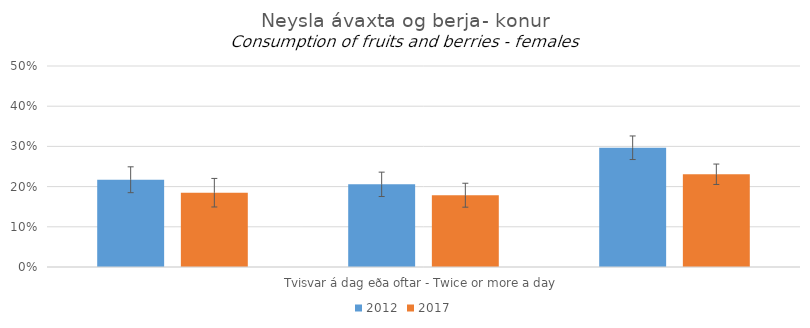
| Category | 2012 | 2017 |
|---|---|---|
| 0 | 0.217 | 0.185 |
| 1 | 0.206 | 0.179 |
| 2 | 0.297 | 0.231 |